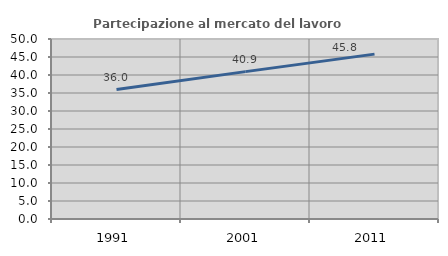
| Category | Partecipazione al mercato del lavoro  femminile |
|---|---|
| 1991.0 | 35.97 |
| 2001.0 | 40.936 |
| 2011.0 | 45.799 |